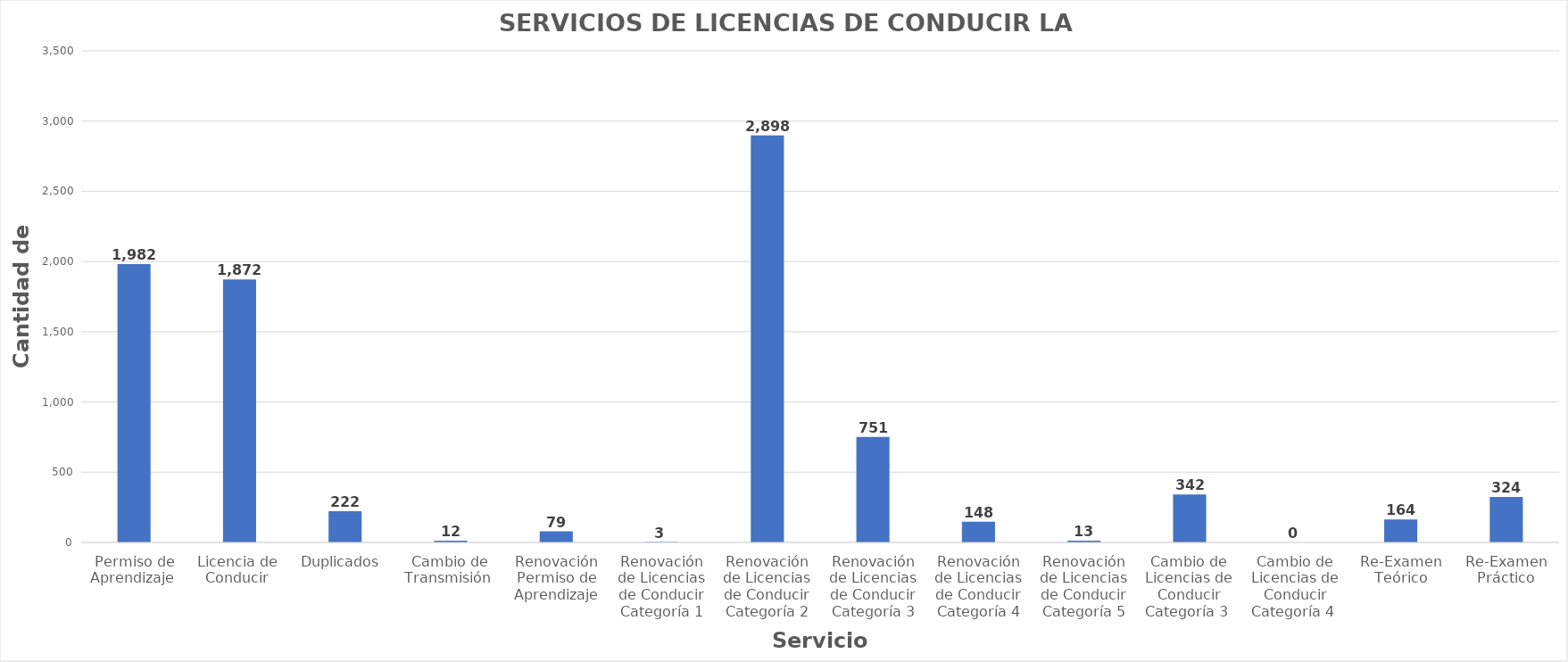
| Category | Series 0 |
|---|---|
| Permiso de Aprendizaje  | 1982 |
| Licencia de  Conducir  | 1872 |
| Duplicados  | 222 |
| Cambio de Transmisión  | 12 |
| Renovación Permiso de Aprendizaje | 79 |
| Renovación de Licencias de Conducir Categoría 1 | 3 |
| Renovación de Licencias de Conducir Categoría 2 | 2898 |
| Renovación de Licencias de Conducir Categoría 3 | 751 |
| Renovación de Licencias de Conducir Categoría 4 | 148 |
| Renovación de Licencias de Conducir Categoría 5 | 13 |
| Cambio de Licencias de Conducir Categoría 3  | 342 |
| Cambio de Licencias de Conducir Categoría 4  | 0 |
| Re-Examen Teórico | 164 |
| Re-Examen Práctico | 324 |